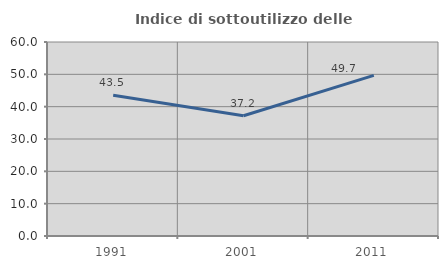
| Category | Indice di sottoutilizzo delle abitazioni  |
|---|---|
| 1991.0 | 43.548 |
| 2001.0 | 37.188 |
| 2011.0 | 49.677 |